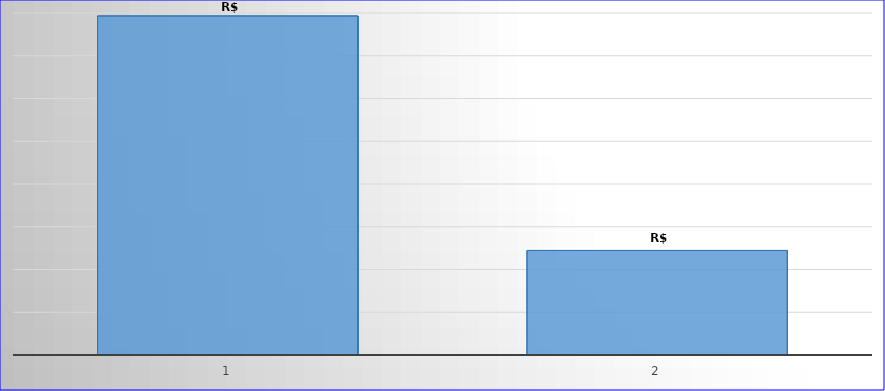
| Category | Series 0 |
|---|---|
| 0 | 15855417.96 |
| 1 | 4889930.26 |